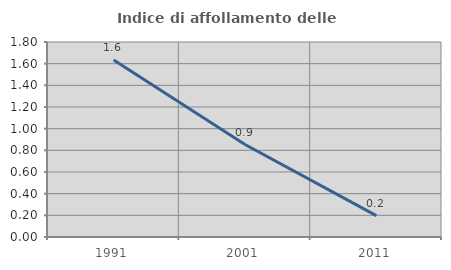
| Category | Indice di affollamento delle abitazioni  |
|---|---|
| 1991.0 | 1.634 |
| 2001.0 | 0.854 |
| 2011.0 | 0.198 |